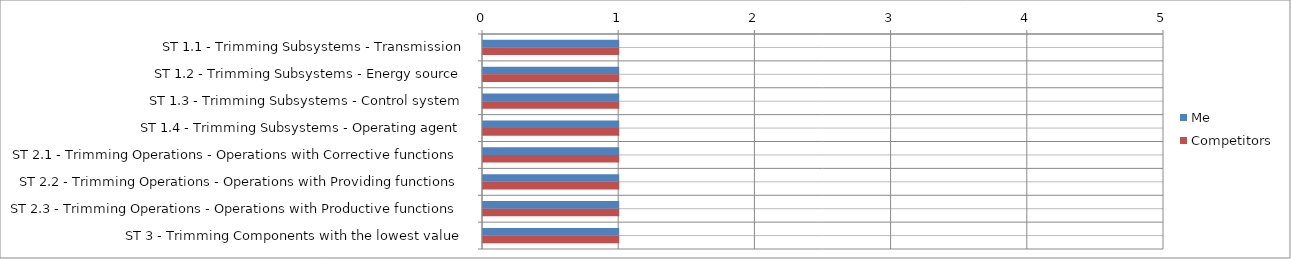
| Category | Me | Competitors |
|---|---|---|
| ST 1.1 - Trimming Subsystems - Transmission | 1 | 1 |
| ST 1.2 - Trimming Subsystems - Energy source | 1 | 1 |
| ST 1.3 - Trimming Subsystems - Control system | 1 | 1 |
| ST 1.4 - Trimming Subsystems - Operating agent | 1 | 1 |
| ST 2.1 - Trimming Operations - Operations with Corrective functions | 1 | 1 |
| ST 2.2 - Trimming Operations - Operations with Providing functions | 1 | 1 |
| ST 2.3 - Trimming Operations - Operations with Productive functions | 1 | 1 |
| ST 3 - Trimming Components with the lowest value | 1 | 1 |